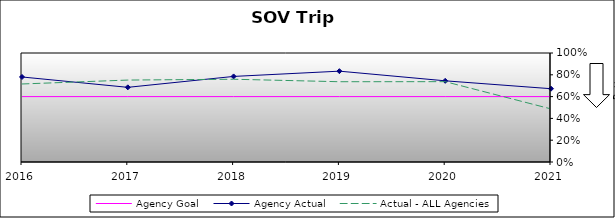
| Category | Agency Goal | Agency Actual | Actual - ALL Agencies |
|---|---|---|---|
| 2016.0 | 0.6 | 0.78 | 0.716 |
| 2017.0 | 0.6 | 0.685 | 0.752 |
| 2018.0 | 0.6 | 0.785 | 0.759 |
| 2019.0 | 0.6 | 0.833 | 0.736 |
| 2020.0 | 0.6 | 0.745 | 0.737 |
| 2021.0 | 0.6 | 0.672 | 0.487 |